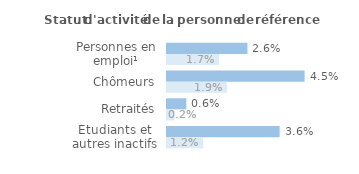
| Category | Series 1 | Series 0 |
|---|---|---|
| Personnes en emploi¹ | 0.026 | 0.017 |
| Chômeurs | 0.045 | 0.019 |
| Retraités | 0.006 | 0.002 |
| Etudiants et autres inactifs | 0.036 | 0.012 |